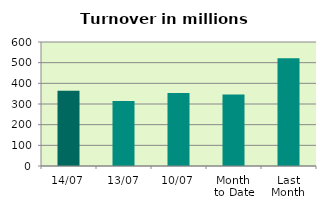
| Category | Series 0 |
|---|---|
| 14/07 | 364.331 |
| 13/07 | 314.854 |
| 10/07 | 353.434 |
| Month 
to Date | 346.275 |
| Last
Month | 521.023 |